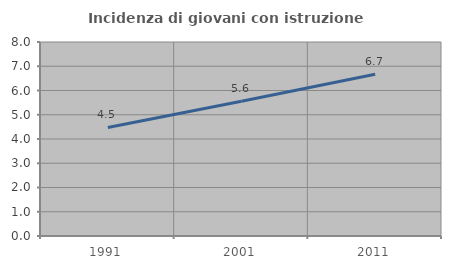
| Category | Incidenza di giovani con istruzione universitaria |
|---|---|
| 1991.0 | 4.478 |
| 2001.0 | 5.556 |
| 2011.0 | 6.667 |